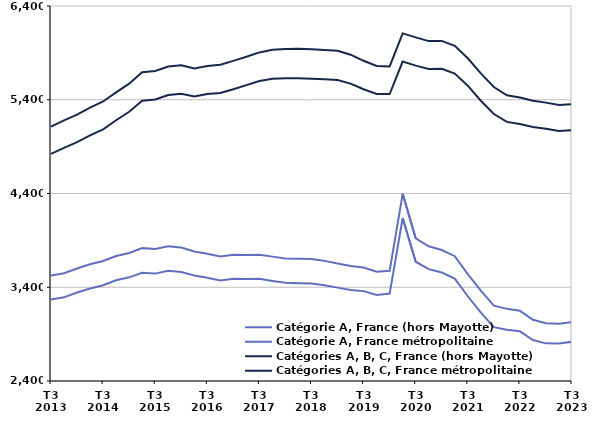
| Category | Catégorie A, France (hors Mayotte) | Catégorie A, France métropolitaine | Catégories A, B, C, France (hors Mayotte) | Catégories A, B, C, France métropolitaine |
|---|---|---|---|---|
| T3
2013 | 3526.3 | 3270.2 | 5113.8 | 4822.8 |
| T4
2013 | 3549.3 | 3292.2 | 5179.6 | 4886.7 |
| T1
2014 | 3599.8 | 3343.3 | 5242.1 | 4948.8 |
| T2
2014 | 3644.7 | 3386.6 | 5315.4 | 5020.2 |
| T3
2014 | 3680.5 | 3421.2 | 5381.3 | 5084.4 |
| T4
2014 | 3733.2 | 3474 | 5479.3 | 5181.5 |
| T1
2015 | 3765.7 | 3505.6 | 5571.4 | 5271.8 |
| T2
2015 | 3817.2 | 3554.7 | 5692.5 | 5388.9 |
| T3
2015 | 3807.4 | 3545.5 | 5706.9 | 5402.8 |
| T4
2015 | 3837.4 | 3576.9 | 5753.9 | 5450.5 |
| T1
2016 | 3823.5 | 3563.5 | 5767.1 | 5463.7 |
| T2
2016 | 3780.9 | 3525 | 5733.1 | 5434 |
| T3
2016 | 3757.9 | 3502.3 | 5760.5 | 5460.6 |
| T4
2016 | 3727.6 | 3471.3 | 5772.8 | 5471.4 |
| T1
2017 | 3747.3 | 3490.1 | 5814.6 | 5512.3 |
| T2
2017 | 3744.7 | 3488.7 | 5858 | 5555.6 |
| T3
2017 | 3746.4 | 3489.5 | 5905 | 5600.3 |
| T4
2017 | 3726.6 | 3467.4 | 5933.3 | 5624.8 |
| T1
2018 | 3707.2 | 3446.8 | 5941 | 5630.6 |
| T2
2018 | 3703.5 | 3442.6 | 5943.1 | 5630.6 |
| T3
2018 | 3701 | 3440.7 | 5937.4 | 5625 |
| T4
2018 | 3681.3 | 3422.4 | 5929.6 | 5617.8 |
| T1
2019 | 3653.9 | 3396 | 5923.2 | 5611.3 |
| T2
2019 | 3625.8 | 3371 | 5880.4 | 5572.5 |
| T3
2019 | 3609.8 | 3358.7 | 5815.6 | 5511.7 |
| T4
2019 | 3564.7 | 3318.7 | 5759.5 | 5461 |
| T1
2020 | 3575.7 | 3332.6 | 5755.4 | 5460.8 |
| T2
2020 | 4396.8 | 4139 | 6107.6 | 5807.5 |
| T3
2020 | 3922.1 | 3672.1 | 6065.4 | 5764.1 |
| T4
2020 | 3836.5 | 3593.4 | 6025.6 | 5728.8 |
| T1
2021 | 3797.6 | 3557 | 6027.6 | 5731.1 |
| T2
2021 | 3731 | 3491.8 | 5974.6 | 5679.8 |
| T3
2021 | 3539.9 | 3303.9 | 5842.6 | 5550.2 |
| T4
2021 | 3363.3 | 3128.8 | 5680.8 | 5389.5 |
| T1
2022 | 3203.4 | 2974.4 | 5536 | 5248.1 |
| T2
2022 | 3169.5 | 2947.7 | 5448 | 5163.7 |
| T3
2022 | 3148.5 | 2929.9 | 5424.8 | 5142.3 |
| T4
2022 | 3052.7 | 2837 | 5389.5 | 5108.6 |
| T1
2023 | 3016 | 2801.4 | 5369.3 | 5089.6 |
| T2
2023 | 3011.1 | 2799.5 | 5343.2 | 5067.7 |
| T3
2023 | 3028.5 | 2818.8 | 5352 | 5076.6 |